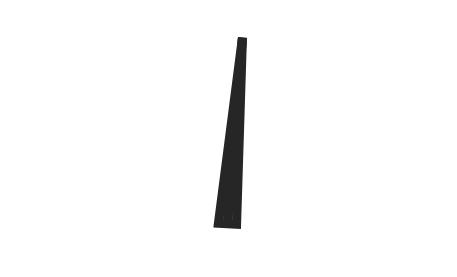
| Category | y |
|---|---|
| 53.28768287244083 | 49.892 |
| 51.995671773145176 | -0.132 |
| 48.004328226854824 | 0.132 |
| 53.28768287244083 | 49.892 |
| 50.0 | 0 |